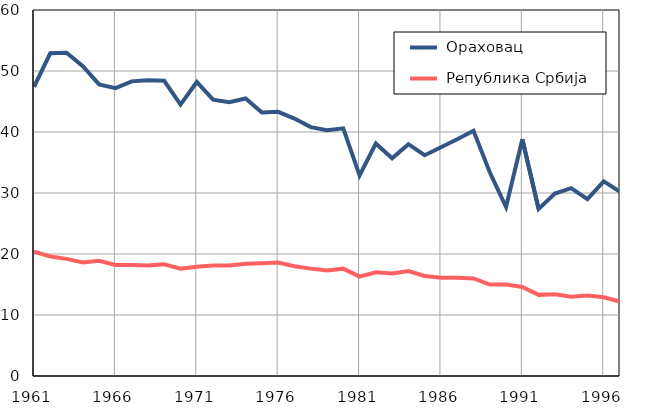
| Category |  Ораховац |  Република Србија |
|---|---|---|
| 1961.0 | 47.4 | 20.4 |
| 1962.0 | 52.9 | 19.6 |
| 1963.0 | 53 | 19.2 |
| 1964.0 | 50.8 | 18.6 |
| 1965.0 | 47.8 | 18.9 |
| 1966.0 | 47.2 | 18.2 |
| 1967.0 | 48.3 | 18.2 |
| 1968.0 | 48.5 | 18.1 |
| 1969.0 | 48.4 | 18.3 |
| 1970.0 | 44.5 | 17.6 |
| 1971.0 | 48.2 | 17.9 |
| 1972.0 | 45.3 | 18.1 |
| 1973.0 | 44.9 | 18.1 |
| 1974.0 | 45.5 | 18.4 |
| 1975.0 | 43.2 | 18.5 |
| 1976.0 | 43.3 | 18.6 |
| 1977.0 | 42.2 | 18 |
| 1978.0 | 40.8 | 17.6 |
| 1979.0 | 40.3 | 17.3 |
| 1980.0 | 40.6 | 17.6 |
| 1981.0 | 32.9 | 16.3 |
| 1982.0 | 38.1 | 17 |
| 1983.0 | 35.7 | 16.8 |
| 1984.0 | 38 | 17.2 |
| 1985.0 | 36.2 | 16.4 |
| 1986.0 | 37.5 | 16.1 |
| 1987.0 | 38.8 | 16.1 |
| 1988.0 | 40.2 | 16 |
| 1989.0 | 33.4 | 15 |
| 1990.0 | 27.7 | 15 |
| 1991.0 | 38.8 | 14.6 |
| 1992.0 | 27.4 | 13.3 |
| 1993.0 | 29.9 | 13.4 |
| 1994.0 | 30.8 | 13 |
| 1995.0 | 29 | 13.2 |
| 1996.0 | 31.9 | 12.9 |
| 1997.0 | 30.2 | 12.2 |